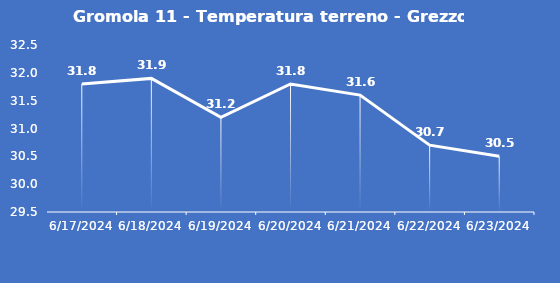
| Category | Gromola 11 - Temperatura terreno - Grezzo (°C) |
|---|---|
| 6/17/24 | 31.8 |
| 6/18/24 | 31.9 |
| 6/19/24 | 31.2 |
| 6/20/24 | 31.8 |
| 6/21/24 | 31.6 |
| 6/22/24 | 30.7 |
| 6/23/24 | 30.5 |